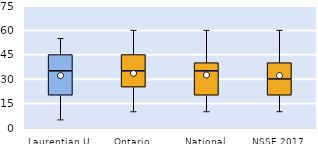
| Category | 25th | 50th | 75th |
|---|---|---|---|
| Laurentian U | 20 | 15 | 10 |
| Ontario | 25 | 10 | 10 |
| National | 20 | 15 | 5 |
| NSSE 2017 | 20 | 10 | 10 |